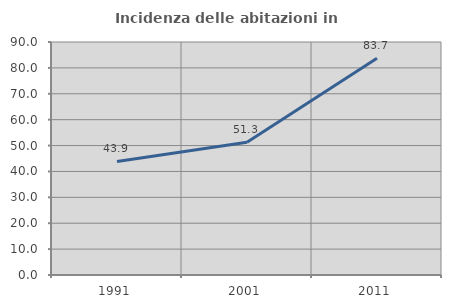
| Category | Incidenza delle abitazioni in proprietà  |
|---|---|
| 1991.0 | 43.851 |
| 2001.0 | 51.281 |
| 2011.0 | 83.694 |